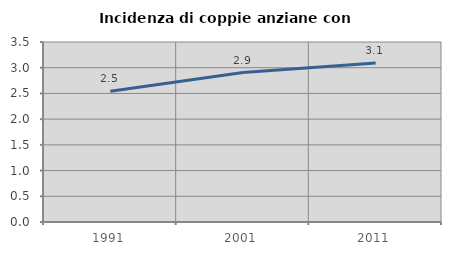
| Category | Incidenza di coppie anziane con figli |
|---|---|
| 1991.0 | 2.541 |
| 2001.0 | 2.905 |
| 2011.0 | 3.091 |